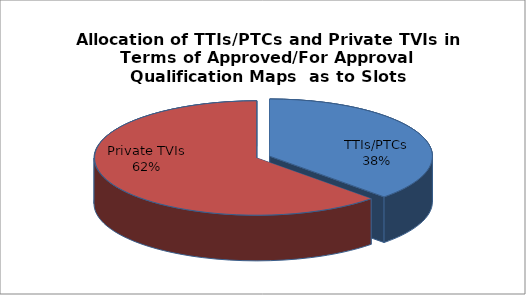
| Category | Series 0 |
|---|---|
| TTIs/PTCs | 9145 |
| Private TVIs | 15181 |